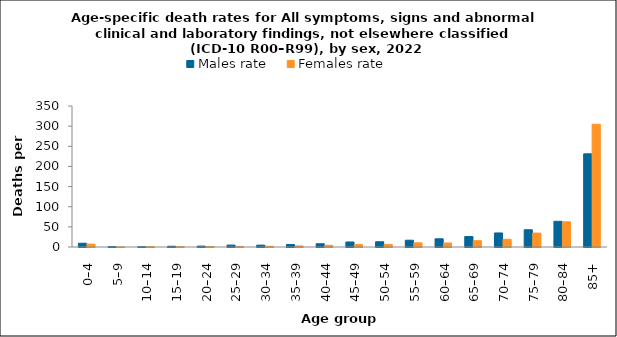
| Category | Males rate | Females rate |
|---|---|---|
| 0–4 | 9.392 | 7.203 |
| 5–9 | 1.085 | 0.256 |
| 10–14 | 0.713 | 0.879 |
| 15–19 | 1.897 | 0.807 |
| 20–24 | 2.246 | 1.263 |
| 25–29 | 4.759 | 1.108 |
| 30–34 | 4.643 | 1.653 |
| 35–39 | 6.274 | 2.62 |
| 40–44 | 8.078 | 4.171 |
| 45–49 | 12.452 | 6.102 |
| 50–54 | 13.024 | 6.549 |
| 55–59 | 16.832 | 10.381 |
| 60–64 | 20.399 | 9.91 |
| 65–69 | 25.984 | 15.689 |
| 70–74 | 34.835 | 19.2 |
| 75–79 | 42.754 | 34.568 |
| 80–84 | 63.776 | 62.585 |
| 85+ | 231.212 | 304.805 |